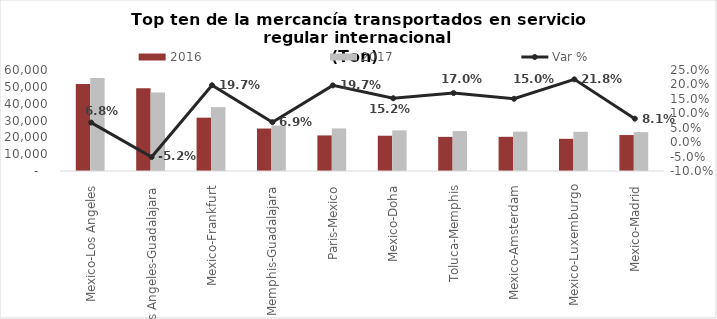
| Category | 2016 | 2017 |
|---|---|---|
| Mexico-Los Angeles | 51746.295 | 55255.113 |
| Los Angeles-Guadalajara | 49154.259 | 46608.319 |
| Mexico-Frankfurt | 31687.134 | 37935.387 |
| Memphis-Guadalajara | 25229.527 | 26973.64 |
| Paris-Mexico | 21135.524 | 25293.593 |
| Mexico-Doha | 20954.688 | 24143.106 |
| Toluca-Memphis | 20276.947 | 23724.781 |
| Mexico-Amsterdam | 20315.647 | 23367.354 |
| Mexico-Luxemburgo | 19120.692 | 23282.068 |
| Mexico-Madrid | 21365.149 | 23103.509 |